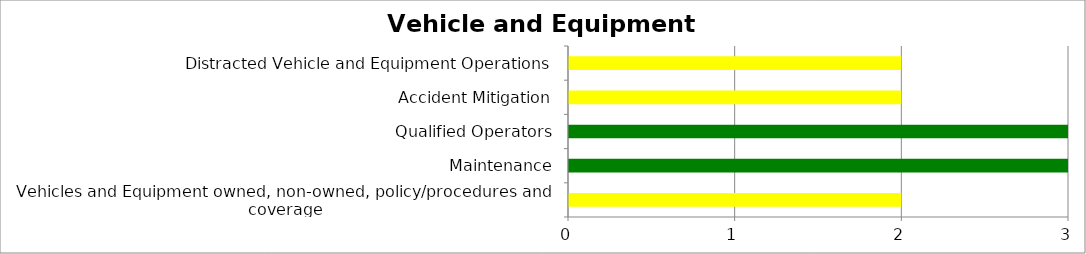
| Category | Low | Medium | High |
|---|---|---|---|
| Vehicles and Equipment owned, non-owned, policy/procedures and coverage | 0 | 2 | 0 |
| Maintenance | 3 | 0 | 0 |
| Qualified Operators | 3 | 0 | 0 |
| Accident Mitigation | 0 | 2 | 0 |
| Distracted Vehicle and Equipment Operations | 0 | 2 | 0 |